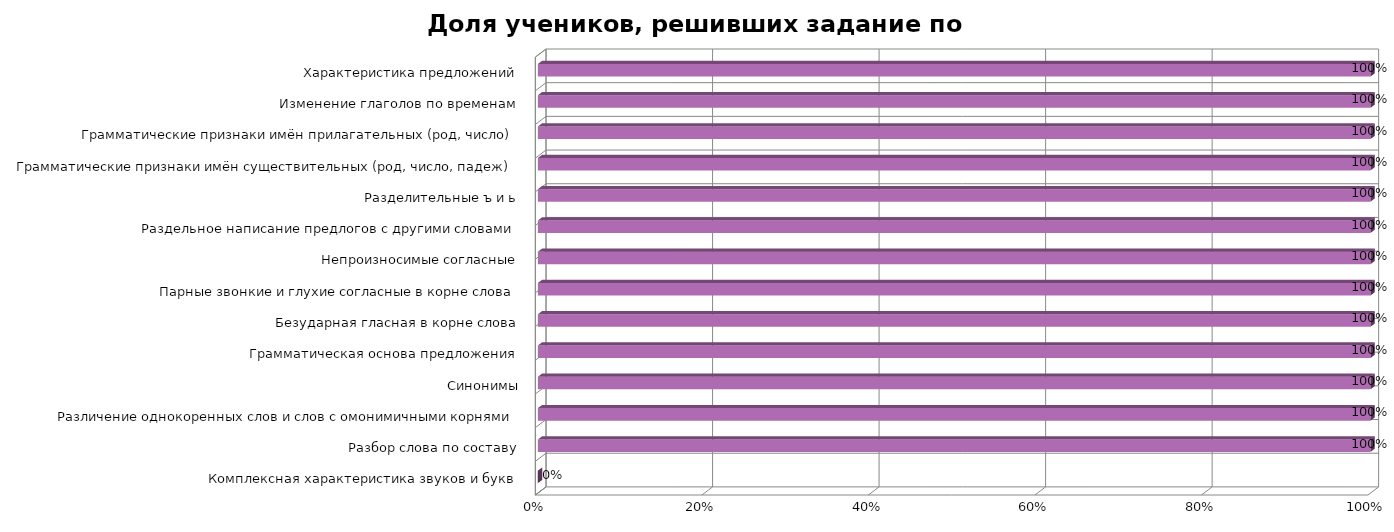
| Category | Доля учеников, решивших задание по теме |
|---|---|
| Комплексная характеристика звуков и букв | 0 |
| Разбор слова по составу | 1 |
| Различение однокоренных слов и слов с омонимичными корнями | 1 |
| Синонимы | 1 |
| Грамматическая основа предложения | 1 |
| Безударная гласная в корне слова | 1 |
| Парные звонкие и глухие согласные в корне слова | 1 |
| Непроизносимые согласные | 1 |
| Раздельное написание предлогов с другими словами | 1 |
| Разделительные ъ и ь | 1 |
| Грамматические признаки имён существительных (род, число, падеж) | 1 |
| Грамматические признаки имён прилагательных (род, число) | 1 |
| Изменение глаголов по временам | 1 |
| Характеристика предложений | 1 |